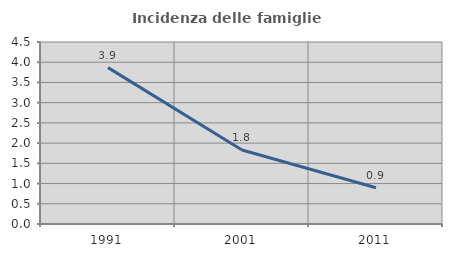
| Category | Incidenza delle famiglie numerose |
|---|---|
| 1991.0 | 3.867 |
| 2001.0 | 1.829 |
| 2011.0 | 0.896 |